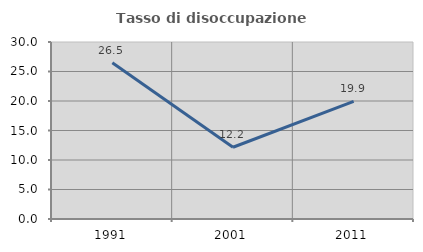
| Category | Tasso di disoccupazione giovanile  |
|---|---|
| 1991.0 | 26.485 |
| 2001.0 | 12.16 |
| 2011.0 | 19.932 |